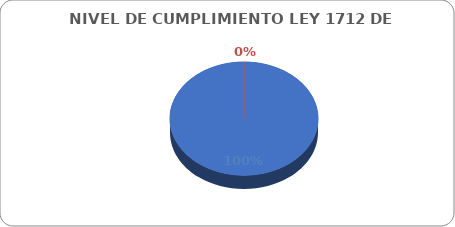
| Category | Series 0 |
|---|---|
| CUMPLIDOS | 116 |
| NO CUMPLIDOS | 0 |